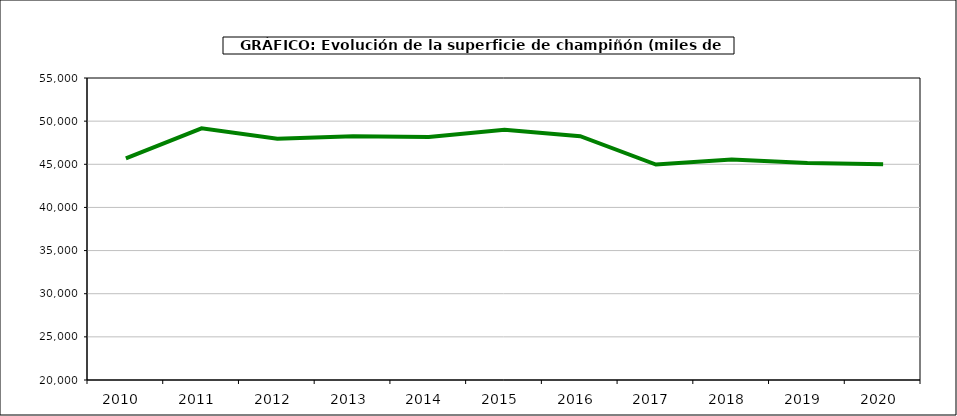
| Category | superficie |
|---|---|
| 2010.0 | 45697 |
| 2011.0 | 49173 |
| 2012.0 | 47970 |
| 2013.0 | 48261 |
| 2014.0 | 48171 |
| 2015.0 | 48998 |
| 2016.0 | 48254 |
| 2017.0 | 44974 |
| 2018.0 | 45565 |
| 2019.0 | 45141 |
| 2020.0 | 44992 |